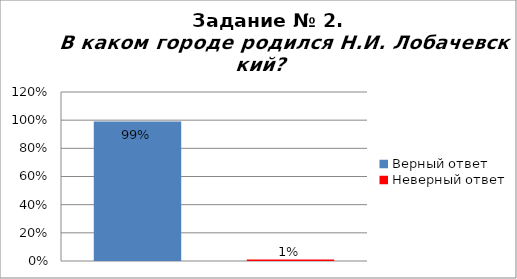
| Category | В каком городе родился Н.И. Лобачевский? |
|---|---|
| Верный ответ | 0.99 |
| Неверный ответ | 0.01 |